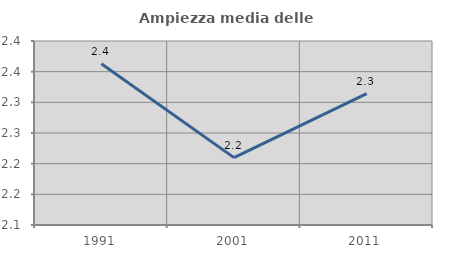
| Category | Ampiezza media delle famiglie |
|---|---|
| 1991.0 | 2.363 |
| 2001.0 | 2.21 |
| 2011.0 | 2.314 |